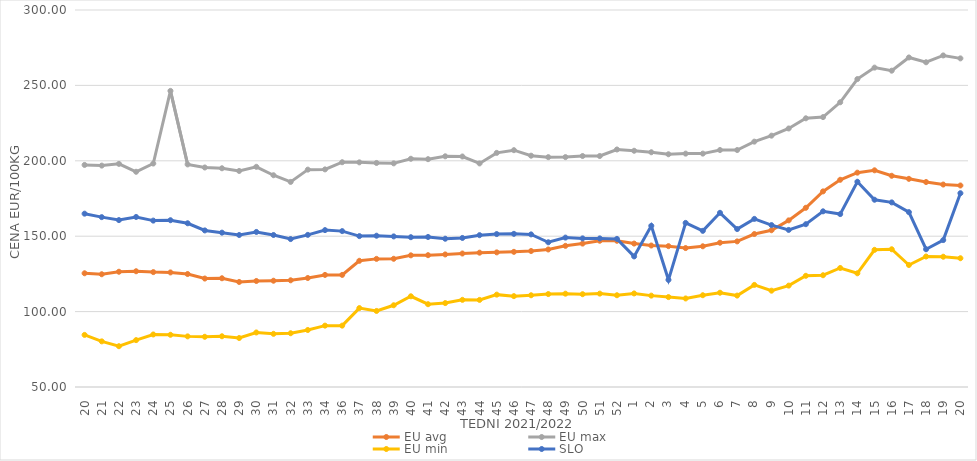
| Category | EU avg | EU max | EU min | SLO |
|---|---|---|---|---|
| 20.0 | 125.412 | 197.263 | 84.55 | 164.94 |
| 21.0 | 124.768 | 196.821 | 80.264 | 162.64 |
| 22.0 | 126.43 | 197.963 | 77.048 | 160.68 |
| 23.0 | 126.76 | 192.72 | 81.087 | 162.75 |
| 24.0 | 126.19 | 198.186 | 84.83 | 160.34 |
| 25.0 | 125.97 | 246.36 | 84.63 | 160.6 |
| 26.0 | 124.92 | 197.607 | 83.57 | 158.57 |
| 27.0 | 121.922 | 195.566 | 83.3 | 153.83 |
| 28.0 | 122.106 | 195.043 | 83.64 | 152.35 |
| 29.0 | 119.659 | 193.272 | 82.49 | 150.79 |
| 30.0 | 120.3 | 196.01 | 86.16 | 152.82 |
| 31.0 | 120.473 | 190.42 | 85.26 | 150.8 |
| 32.0 | 120.756 | 186 | 85.65 | 148.1 |
| 33.0 | 122.274 | 194.145 | 87.8 | 150.88 |
| 34.0 | 124.332 | 194.304 | 90.69 | 154.04 |
| 36.0 | 124.332 | 199.06 | 90.69 | 153.37 |
| 37.0 | 133.685 | 198.97 | 102.334 | 150.06 |
| 38.0 | 134.959 | 198.57 | 100.43 | 150.32 |
| 39.0 | 135.021 | 198.3 | 104.21 | 149.86 |
| 40.0 | 137.315 | 201.34 | 110.15 | 149.34 |
| 41.0 | 137.411 | 201.081 | 104.9 | 149.48 |
| 42.0 | 137.908 | 202.98 | 105.65 | 148.32 |
| 43.0 | 138.52 | 202.856 | 107.8 | 148.83 |
| 44.0 | 139.076 | 198.26 | 107.75 | 150.69 |
| 45.0 | 139.275 | 205.257 | 111.25 | 151.41 |
| 46.0 | 139.626 | 207.046 | 110.26 | 151.56 |
| 47.0 | 140.17 | 203.387 | 110.83 | 151.2 |
| 48.0 | 141.2 | 202.42 | 111.62 | 145.97 |
| 49.0 | 143.614 | 202.45 | 111.89 | 149.07 |
| 50.0 | 145.101 | 203.17 | 111.54 | 148.55 |
| 51.0 | 146.984 | 203.17 | 111.93 | 148.54 |
| 52.0 | 146.958 | 207.5 | 110.85 | 148.22 |
| 1.0 | 145.11 | 206.66 | 112.04 | 136.59 |
| 2.0 | 143.822 | 205.67 | 110.59 | 156.88 |
| 3.0 | 143.402 | 204.34 | 109.62 | 121.07 |
| 4.0 | 142.134 | 204.76 | 108.71 | 158.82 |
| 5.0 | 143.314 | 204.76 | 110.86 | 153.55 |
| 6.0 | 145.677 | 207.14 | 112.52 | 165.51 |
| 7.0 | 146.556 | 207.14 | 110.619 | 154.74 |
| 8.0 | 151.439 | 212.7 | 117.709 | 161.48 |
| 9.0 | 153.947 | 216.67 | 113.871 | 157.38 |
| 10.0 | 160.496 | 221.43 | 117.233 | 154.16 |
| 11.0 | 168.845 | 228.17 | 123.737 | 157.96 |
| 12.0 | 179.714 | 228.97 | 124.105 | 166.49 |
| 13.0 | 187.409 | 238.81 | 128.918 | 164.66 |
| 14.0 | 192.137 | 254.21 | 125.399 | 186.11 |
| 15.0 | 193.697 | 261.79 | 140.954 | 174.18 |
| 16.0 | 190.066 | 259.76 | 141.337 | 172.42 |
| 17.0 | 188.031 | 268.52 | 130.897 | 165.96 |
| 18.0 | 185.925 | 265.34 | 136.529 | 141.36 |
| 19.0 | 184.262 | 269.87 | 136.387 | 147.43 |
| 20.0 | 183.629 | 267.92 | 135.392 | 178.51 |